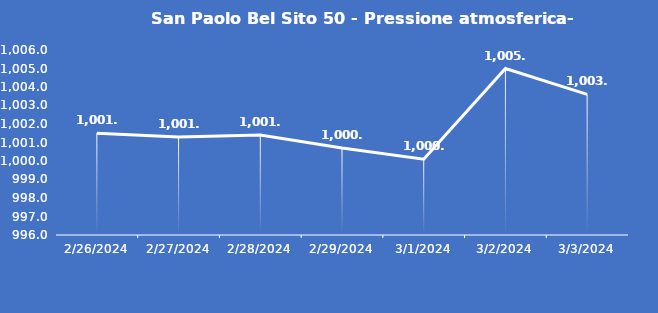
| Category | San Paolo Bel Sito 50 - Pressione atmosferica- Grezzo (hPa) |
|---|---|
| 2/26/24 | 1001.5 |
| 2/27/24 | 1001.3 |
| 2/28/24 | 1001.4 |
| 2/29/24 | 1000.7 |
| 3/1/24 | 1000.1 |
| 3/2/24 | 1005 |
| 3/3/24 | 1003.6 |